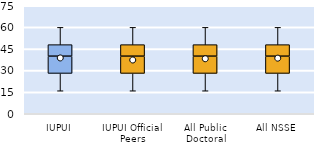
| Category | 25th | 50th | 75th |
|---|---|---|---|
| IUPUI | 28 | 12 | 8 |
| IUPUI Official Peers | 28 | 12 | 8 |
| All Public Doctoral | 28 | 12 | 8 |
| All NSSE | 28 | 12 | 8 |